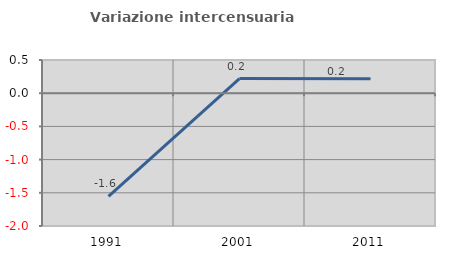
| Category | Variazione intercensuaria annua |
|---|---|
| 1991.0 | -1.555 |
| 2001.0 | 0.221 |
| 2011.0 | 0.216 |